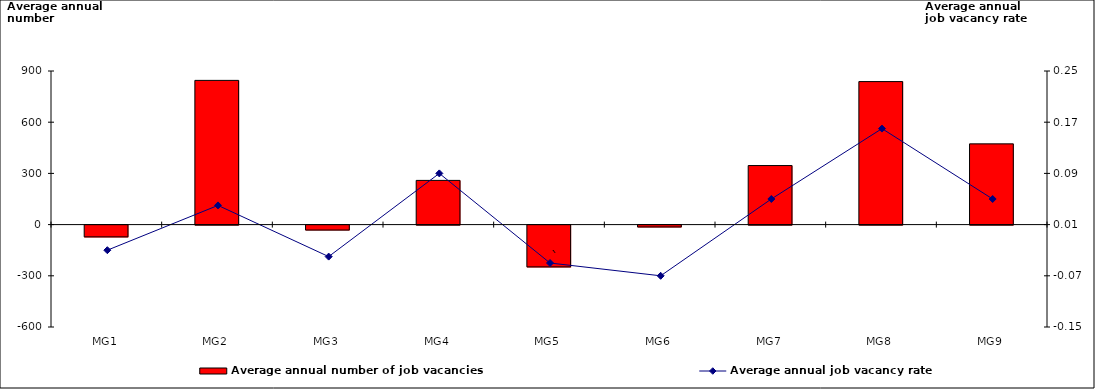
| Category | Average annual number of job vacancies |
|---|---|
| MG1 | -69 |
| MG2 | 845 |
| MG3 | -29 |
| MG4 | 259 |
| MG5 | -245 |
| MG6 | -11 |
| MG7 | 346 |
| MG8 | 838 |
| MG9 | 473 |